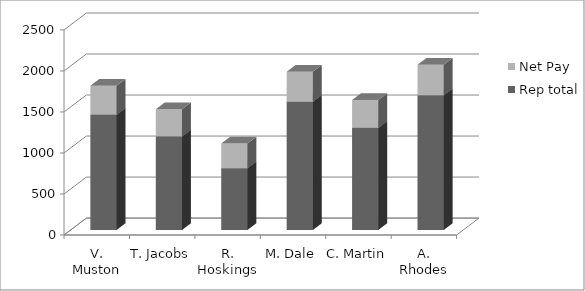
| Category | Rep total | Net Pay |
|---|---|---|
| V. Muston | 1405 | 352.4 |
| T. Jacobs | 1140 | 331.2 |
| R. Hoskings | 753 | 300.24 |
| M. Dale | 1562 | 364.96 |
| C. Martin | 1244 | 339.52 |
| A. Rhodes | 1642 | 371.36 |